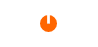
| Category | Black Sea |
|---|---|
| 0 | 0 |
| 1 | 0 |
| 2 | 20657.4 |